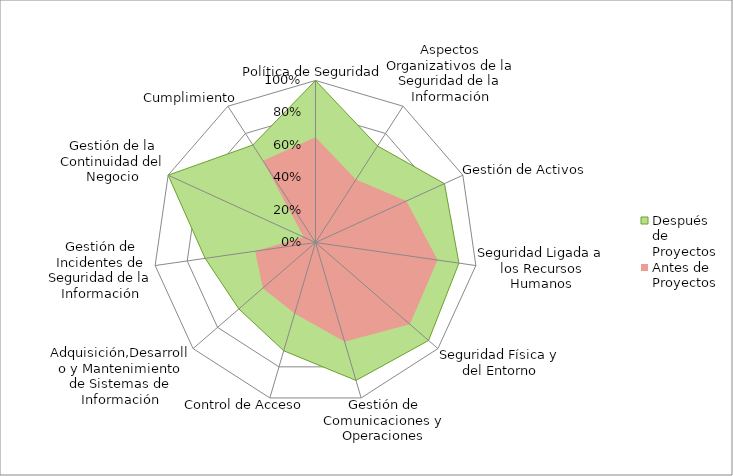
| Category | Después de Proyectos | Antes de Proyectos |
|---|---|---|
| Política de Seguridad | 1 | 0.65 |
| Aspectos Organizativos de la Seguridad de la Información | 0.708 | 0.462 |
| Gestión de Activos | 0.875 | 0.617 |
| Seguridad Ligada a los Recursos Humanos | 0.894 | 0.761 |
| Seguridad Física y del Entorno | 0.923 | 0.771 |
| Gestión de Comunicaciones y Operaciones | 0.887 | 0.639 |
| Control de Acceso | 0.696 | 0.457 |
| Adquisición,Desarrollo y Mantenimiento de Sistemas de Información | 0.626 | 0.431 |
| Gestión de Incidentes de Seguridad de la Información | 0.688 | 0.376 |
| Gestión de la Continuidad del Negocio | 1 | 0.08 |
| Cumplimiento | 0.715 | 0.6 |